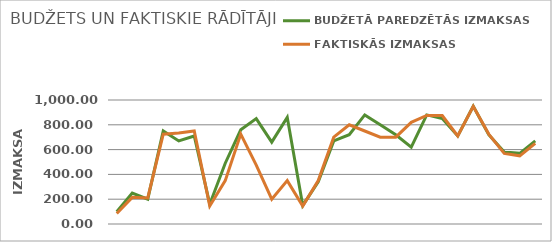
| Category | BUDŽETĀ PAREDZĒTĀS IZMAKSAS | FAKTISKĀS IZMAKSAS |
|---|---|---|
| 0 | 100 | 85 |
| 1 | 250 | 215 |
| 2 | 200 | 210 |
| 3 | 750 | 724 |
| 4 | 670 | 733 |
| 5 | 710 | 750 |
| 6 | 160 | 145 |
| 7 | 490 | 350 |
| 8 | 760 | 725 |
| 9 | 850 | 475 |
| 10 | 660 | 200 |
| 11 | 860 | 350 |
| 12 | 150 | 144 |
| 13 | 340 | 350 |
| 14 | 670 | 700 |
| 15 | 720 | 800 |
| 16 | 880 | 750 |
| 17 | 800 | 700 |
| 18 | 720 | 700 |
| 19 | 620 | 820 |
| 20 | 880 | 875 |
| 21 | 850 | 875 |
| 22 | 710 | 710 |
| 23 | 950 | 949 |
| 24 | 720 | 725 |
| 25 | 580 | 569 |
| 26 | 570 | 550 |
| 27 | 670 | 650 |